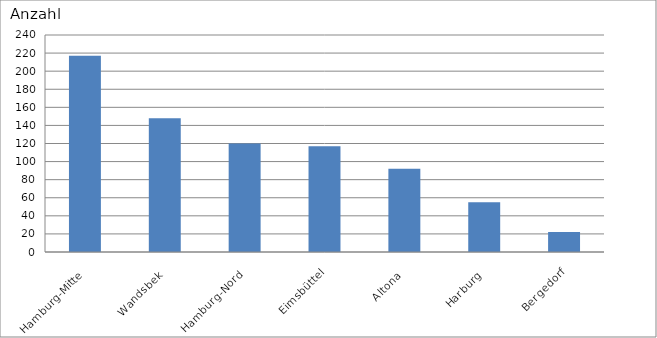
| Category | Hamburg-Mitte Wandsbek Hamburg-Nord Eimsbüttel Altona Harburg Bergedorf |
|---|---|
| Hamburg-Mitte | 217 |
| Wandsbek | 148 |
| Hamburg-Nord | 120 |
| Eimsbüttel | 117 |
| Altona | 92 |
| Harburg | 55 |
| Bergedorf | 22 |